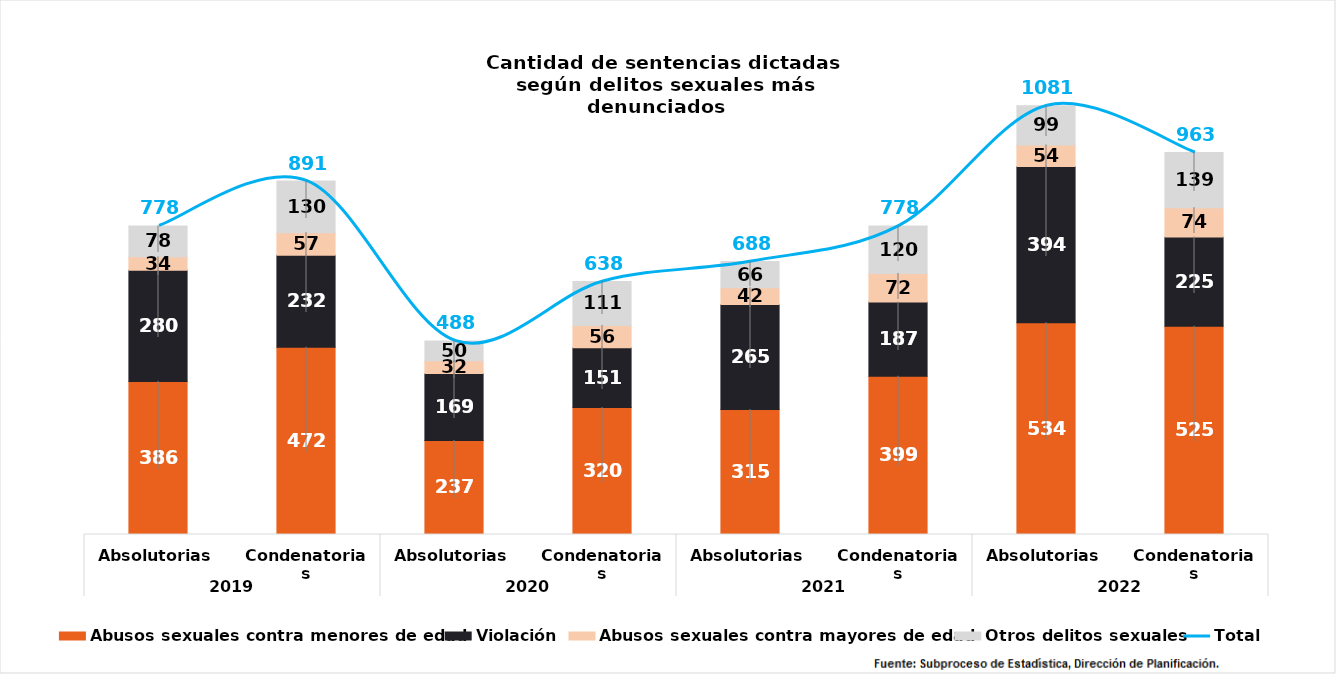
| Category | Abusos sexuales contra menores de edad | Violación | Abusos sexuales contra mayores de edad | Otros delitos sexuales |
|---|---|---|---|---|
| 0 | 386 | 280 | 34 | 78 |
| 1 | 472 | 232 | 57 | 130 |
| 2 | 237 | 169 | 32 | 50 |
| 3 | 320 | 151 | 56 | 111 |
| 4 | 315 | 265 | 42 | 66 |
| 5 | 399 | 187 | 72 | 120 |
| 6 | 534 | 394 | 54 | 99 |
| 7 | 525 | 225 | 74 | 139 |